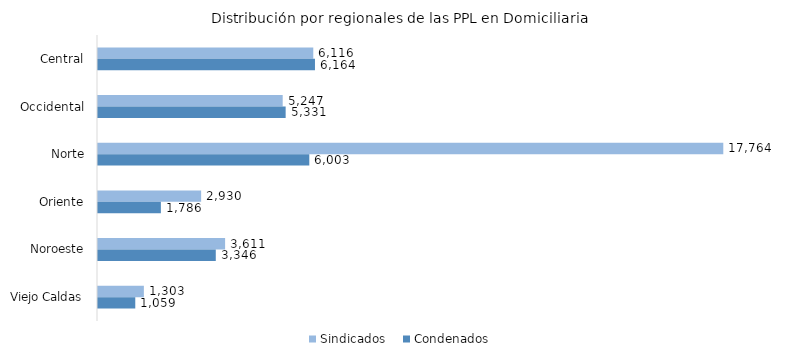
| Category | Sindicados | Condenados |
|---|---|---|
| Central | 6116 | 6164 |
| Occidental | 5247 | 5331 |
| Norte | 17764 | 6003 |
| Oriente | 2930 | 1786 |
| Noroeste | 3611 | 3346 |
| Viejo Caldas | 1303 | 1059 |